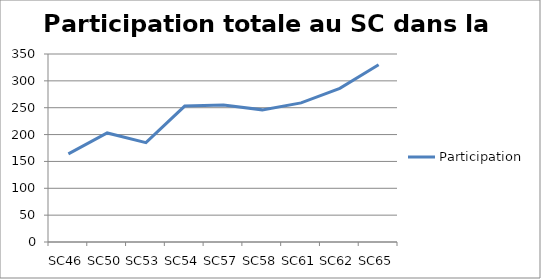
| Category | Participation |
|---|---|
| SC46 | 164 |
| SC50 | 203 |
| SC53 | 185 |
| SC54 | 253 |
| SC57 | 255 |
| SC58 | 246 |
| SC61 | 259 |
| SC62 | 286 |
| SC65 | 330 |